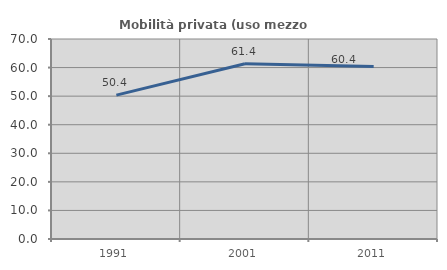
| Category | Mobilità privata (uso mezzo privato) |
|---|---|
| 1991.0 | 50.369 |
| 2001.0 | 61.364 |
| 2011.0 | 60.363 |